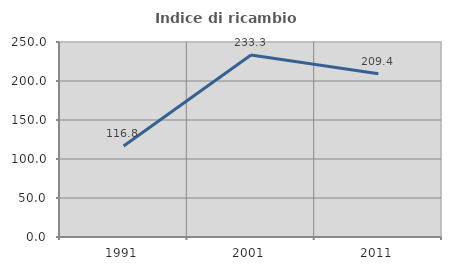
| Category | Indice di ricambio occupazionale  |
|---|---|
| 1991.0 | 116.781 |
| 2001.0 | 233.333 |
| 2011.0 | 209.386 |